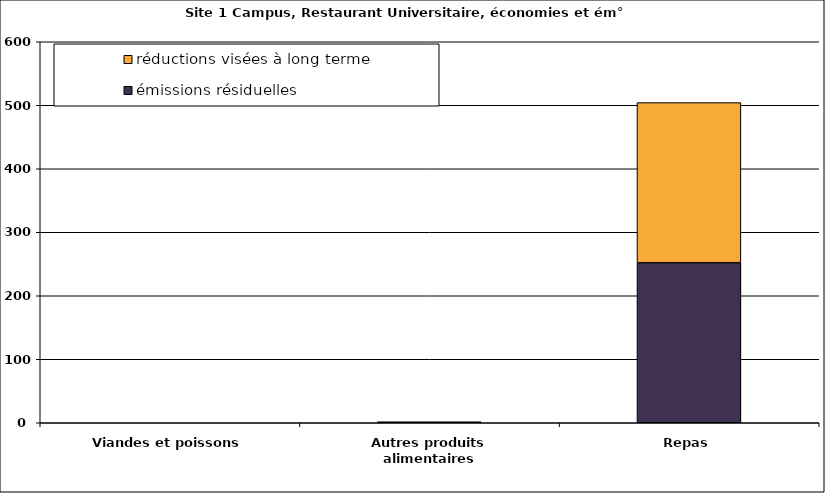
| Category | émissions résiduelles | réductions visées à long terme |
|---|---|---|
| Viandes et poissons | 0 | 0 |
| Autres produits alimentaires | 1.624 | 0 |
| Repas | 252.112 | 252.112 |